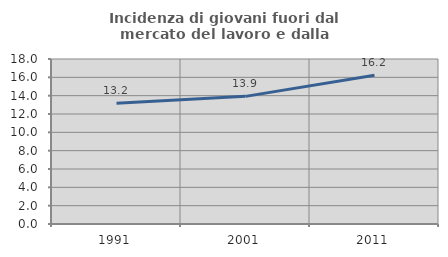
| Category | Incidenza di giovani fuori dal mercato del lavoro e dalla formazione  |
|---|---|
| 1991.0 | 13.182 |
| 2001.0 | 13.924 |
| 2011.0 | 16.23 |